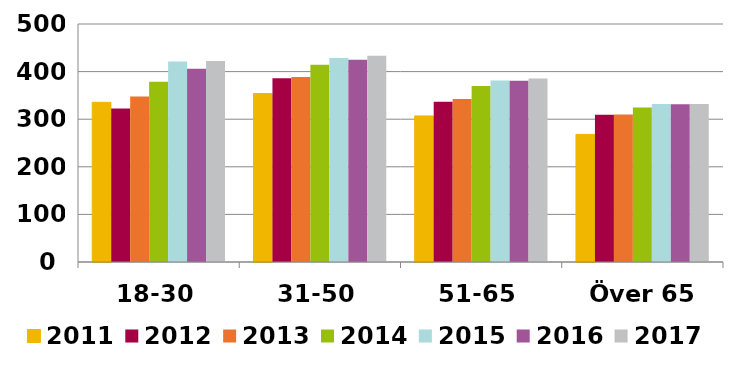
| Category | 2011 | 2012 | 2013 | 2014 | 2015 | 2016 | 2017 |
|---|---|---|---|---|---|---|---|
| 18-30 | 335.468 | 322.493 | 347.703 | 378.603 | 421.058 | 406.006 | 422.443 |
| 31-50 | 353.818 | 386.206 | 388.47 | 414.302 | 428.583 | 424.826 | 433.052 |
| 51-65 | 306.875 | 336.843 | 342.548 | 369.899 | 381.426 | 380.872 | 385.651 |
| Över 65 | 268.028 | 309.57 | 309.987 | 324.476 | 331.753 | 331.438 | 331.912 |